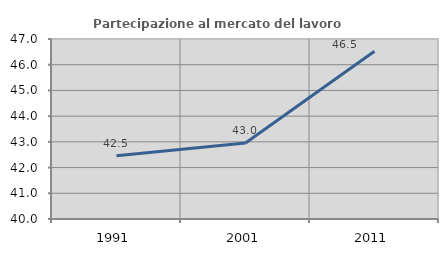
| Category | Partecipazione al mercato del lavoro  femminile |
|---|---|
| 1991.0 | 42.462 |
| 2001.0 | 42.959 |
| 2011.0 | 46.522 |